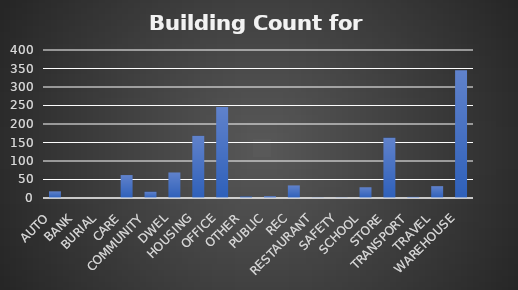
| Category | Series 0 |
|---|---|
| AUTO  | 18 |
| BANK  | 0 |
| BURIAL  | 0 |
| CARE  | 62 |
| COMMUNITY  | 17 |
| DWEL  | 69 |
| HOUSING  | 168 |
| OFFICE  | 246 |
| OTHER  | 4 |
| PUBLIC  | 5 |
| REC  | 34 |
| RESTAURANT  | 1 |
| SAFETY  | 1 |
| SCHOOL  | 29 |
| STORE  | 163 |
| TRANSPORT  | 3 |
| TRAVEL  | 32 |
| WAREHOUSE  | 345 |